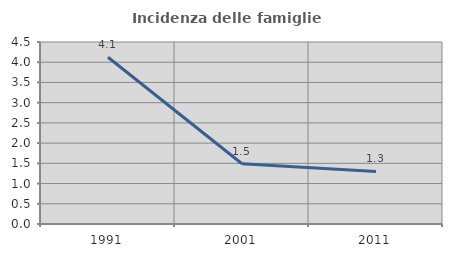
| Category | Incidenza delle famiglie numerose |
|---|---|
| 1991.0 | 4.122 |
| 2001.0 | 1.488 |
| 2011.0 | 1.301 |